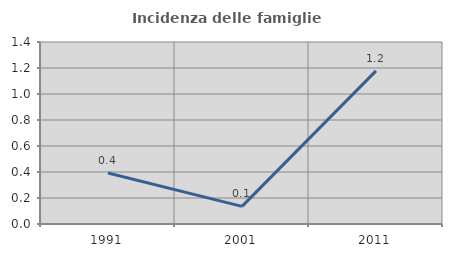
| Category | Incidenza delle famiglie numerose |
|---|---|
| 1991.0 | 0.392 |
| 2001.0 | 0.135 |
| 2011.0 | 1.178 |